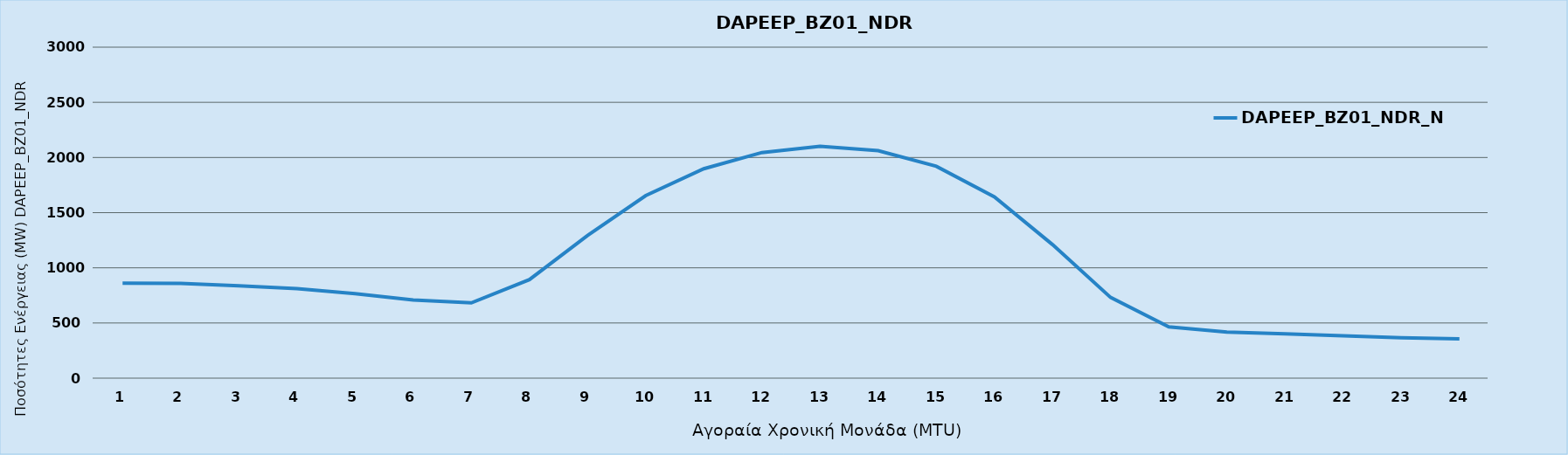
| Category | DAPEEP_BZ01_NDR_N1 |
|---|---|
| 0 | 860 |
| 1 | 858 |
| 2 | 838 |
| 3 | 811 |
| 4 | 766 |
| 5 | 708 |
| 6 | 682 |
| 7 | 893 |
| 8 | 1293 |
| 9 | 1654 |
| 10 | 1898 |
| 11 | 2045 |
| 12 | 2101 |
| 13 | 2062 |
| 14 | 1920 |
| 15 | 1643 |
| 16 | 1210 |
| 17 | 731 |
| 18 | 465 |
| 19 | 417 |
| 20 | 402 |
| 21 | 384 |
| 22 | 367 |
| 23 | 357 |